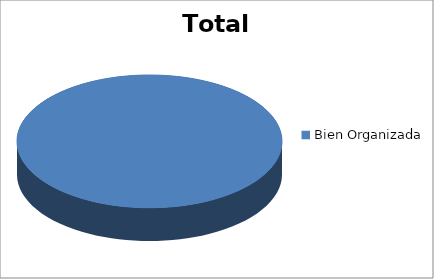
| Category | Total |
|---|---|
| Bien Organizada | 1 |